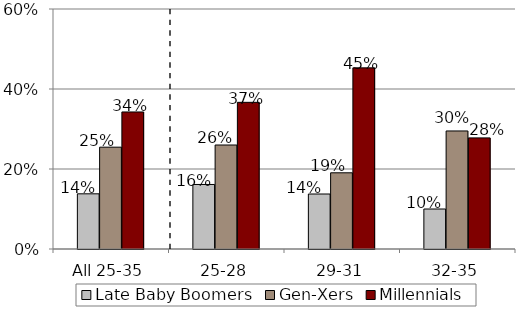
| Category | Late Baby Boomers | Gen-Xers | Millennials |
|---|---|---|---|
| All 25-35 | 0.138 | 0.255 | 0.343 |
| 25-28 | 0.161 | 0.26 | 0.367 |
| 29-31 | 0.138 | 0.19 | 0.453 |
| 32-35 | 0.1 | 0.295 | 0.278 |